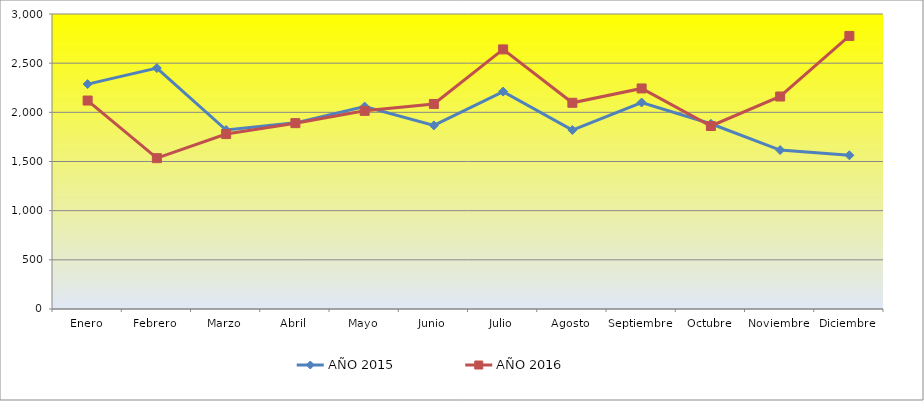
| Category | AÑO 2015 | AÑO 2016 |
|---|---|---|
| Enero | 2287 | 2120 |
| Febrero | 2450 | 1534 |
| Marzo | 1820 | 1779 |
| Abril | 1893 | 1890 |
| Mayo | 2059 | 2015 |
| Junio | 1867 | 2085 |
| Julio | 2211 | 2640 |
| Agosto | 1820 | 2097 |
| Septiembre | 2100 | 2243 |
| Octubre | 1884 | 1861 |
| Noviembre | 1616 | 2161 |
| Diciembre | 1563 | 2777 |